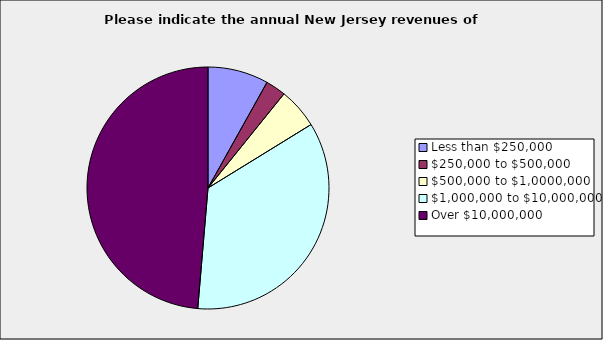
| Category | Series 0 |
|---|---|
| Less than $250,000 | 0.081 |
| $250,000 to $500,000 | 0.027 |
| $500,000 to $1,0000,000 | 0.054 |
| $1,000,000 to $10,000,000 | 0.351 |
| Over $10,000,000 | 0.486 |